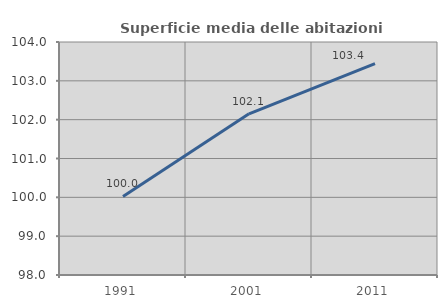
| Category | Superficie media delle abitazioni occupate |
|---|---|
| 1991.0 | 100.023 |
| 2001.0 | 102.149 |
| 2011.0 | 103.444 |